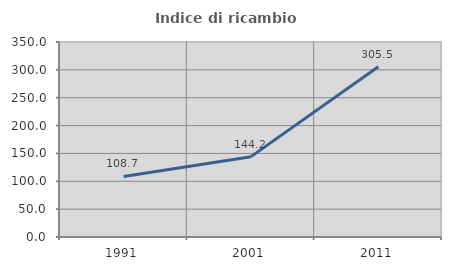
| Category | Indice di ricambio occupazionale  |
|---|---|
| 1991.0 | 108.693 |
| 2001.0 | 144.229 |
| 2011.0 | 305.536 |